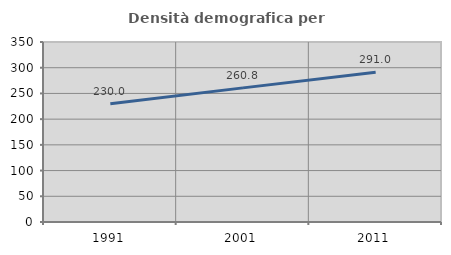
| Category | Densità demografica |
|---|---|
| 1991.0 | 229.975 |
| 2001.0 | 260.793 |
| 2011.0 | 290.96 |